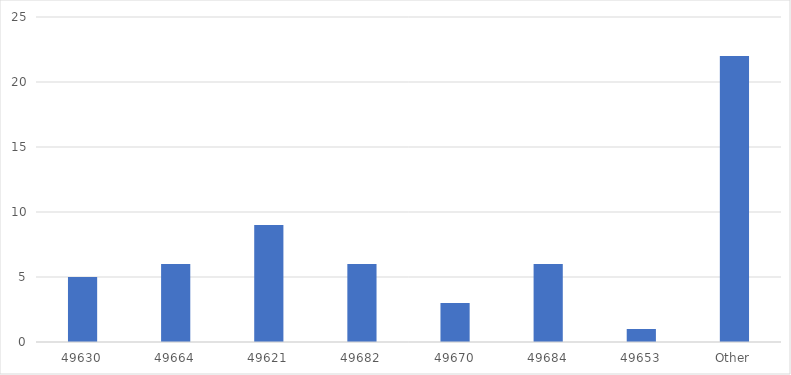
| Category | Number of Responses |
|---|---|
| 49630 | 5 |
| 49664 | 6 |
| 49621 | 9 |
| 49682 | 6 |
| 49670 | 3 |
| 49684 | 6 |
| 49653 | 1 |
| Other | 22 |